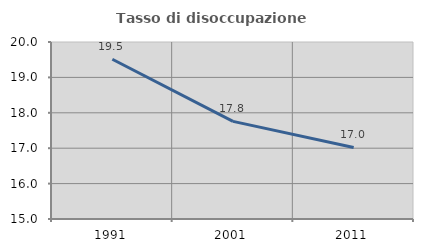
| Category | Tasso di disoccupazione giovanile  |
|---|---|
| 1991.0 | 19.512 |
| 2001.0 | 17.757 |
| 2011.0 | 17.021 |